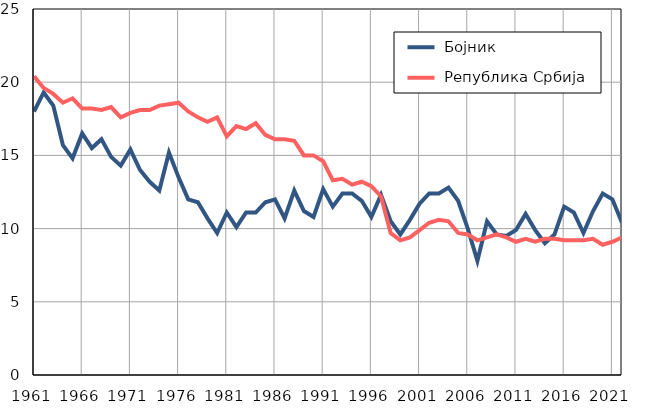
| Category |  Бојник |  Република Србија |
|---|---|---|
| 1961.0 | 18 | 20.4 |
| 1962.0 | 19.3 | 19.6 |
| 1963.0 | 18.4 | 19.2 |
| 1964.0 | 15.7 | 18.6 |
| 1965.0 | 14.8 | 18.9 |
| 1966.0 | 16.5 | 18.2 |
| 1967.0 | 15.5 | 18.2 |
| 1968.0 | 16.1 | 18.1 |
| 1969.0 | 14.9 | 18.3 |
| 1970.0 | 14.3 | 17.6 |
| 1971.0 | 15.4 | 17.9 |
| 1972.0 | 14 | 18.1 |
| 1973.0 | 13.2 | 18.1 |
| 1974.0 | 12.6 | 18.4 |
| 1975.0 | 15.2 | 18.5 |
| 1976.0 | 13.5 | 18.6 |
| 1977.0 | 12 | 18 |
| 1978.0 | 11.8 | 17.6 |
| 1979.0 | 10.7 | 17.3 |
| 1980.0 | 9.7 | 17.6 |
| 1981.0 | 11.1 | 16.3 |
| 1982.0 | 10.1 | 17 |
| 1983.0 | 11.1 | 16.8 |
| 1984.0 | 11.1 | 17.2 |
| 1985.0 | 11.8 | 16.4 |
| 1986.0 | 12 | 16.1 |
| 1987.0 | 10.7 | 16.1 |
| 1988.0 | 12.6 | 16 |
| 1989.0 | 11.2 | 15 |
| 1990.0 | 10.8 | 15 |
| 1991.0 | 12.7 | 14.6 |
| 1992.0 | 11.5 | 13.3 |
| 1993.0 | 12.4 | 13.4 |
| 1994.0 | 12.4 | 13 |
| 1995.0 | 11.9 | 13.2 |
| 1996.0 | 10.8 | 12.9 |
| 1997.0 | 12.3 | 12.2 |
| 1998.0 | 10.5 | 9.7 |
| 1999.0 | 9.6 | 9.2 |
| 2000.0 | 10.6 | 9.4 |
| 2001.0 | 11.7 | 9.9 |
| 2002.0 | 12.4 | 10.4 |
| 2003.0 | 12.4 | 10.6 |
| 2004.0 | 12.8 | 10.5 |
| 2005.0 | 11.9 | 9.7 |
| 2006.0 | 10 | 9.6 |
| 2007.0 | 7.8 | 9.2 |
| 2008.0 | 10.5 | 9.4 |
| 2009.0 | 9.6 | 9.6 |
| 2010.0 | 9.5 | 9.4 |
| 2011.0 | 9.9 | 9.1 |
| 2012.0 | 11 | 9.3 |
| 2013.0 | 9.9 | 9.1 |
| 2014.0 | 9 | 9.3 |
| 2015.0 | 9.6 | 9.3 |
| 2016.0 | 11.5 | 9.2 |
| 2017.0 | 11.1 | 9.2 |
| 2018.0 | 9.7 | 9.2 |
| 2019.0 | 11.2 | 9.3 |
| 2020.0 | 12.4 | 8.9 |
| 2021.0 | 12 | 9.1 |
| 2022.0 | 10.4 | 9.4 |